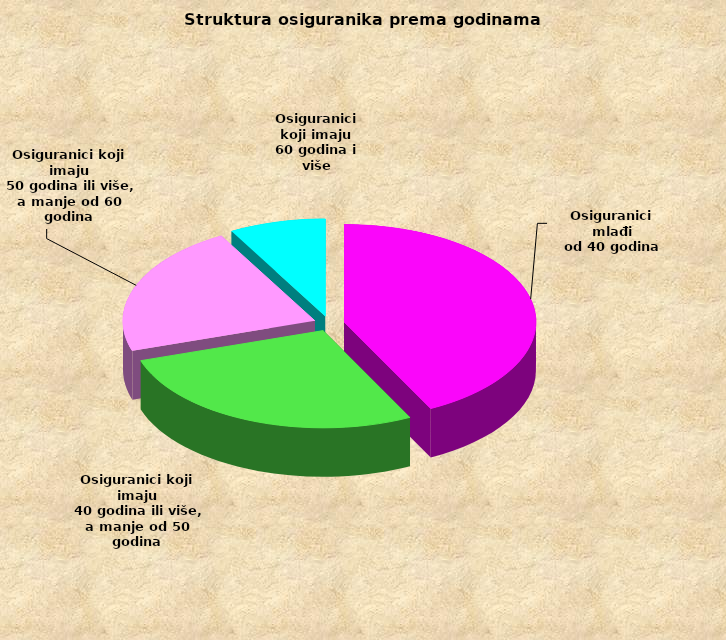
| Category | Series 0 |
|---|---|
| Osiguranici mlađi
od 40 godina | 703450 |
| Osiguranici koji imaju
 40 godina ili više, a manje od 50 godina | 454170 |
| Osiguranici koji imaju
 50 godina ili više, a manje od 60 godina | 362044 |
| Osiguranici koji imaju
60 godina i više | 134216 |